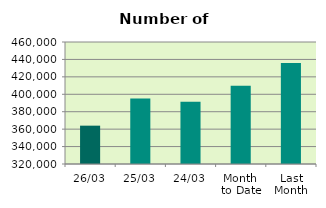
| Category | Series 0 |
|---|---|
| 26/03 | 363990 |
| 25/03 | 395204 |
| 24/03 | 391560 |
| Month 
to Date | 409769.7 |
| Last
Month | 435925.8 |